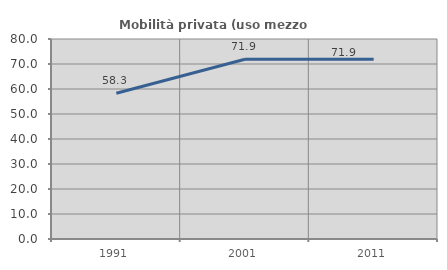
| Category | Mobilità privata (uso mezzo privato) |
|---|---|
| 1991.0 | 58.288 |
| 2001.0 | 71.911 |
| 2011.0 | 71.88 |